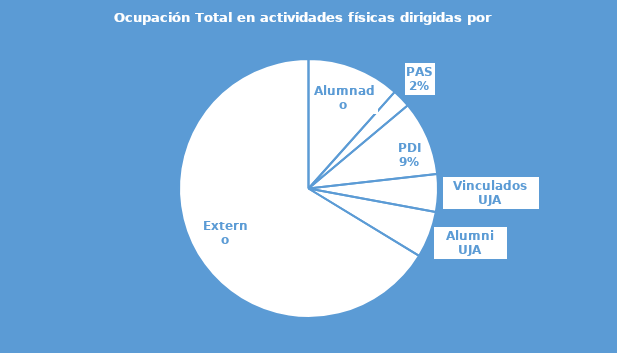
| Category | Series 0 |
|---|---|
| Alumnado | 0.116 |
| PAS | 0.023 |
| PDI | 0.093 |
| Vinculados UJA | 0.047 |
| Alumni UJA | 0.058 |
| Externo | 0.663 |